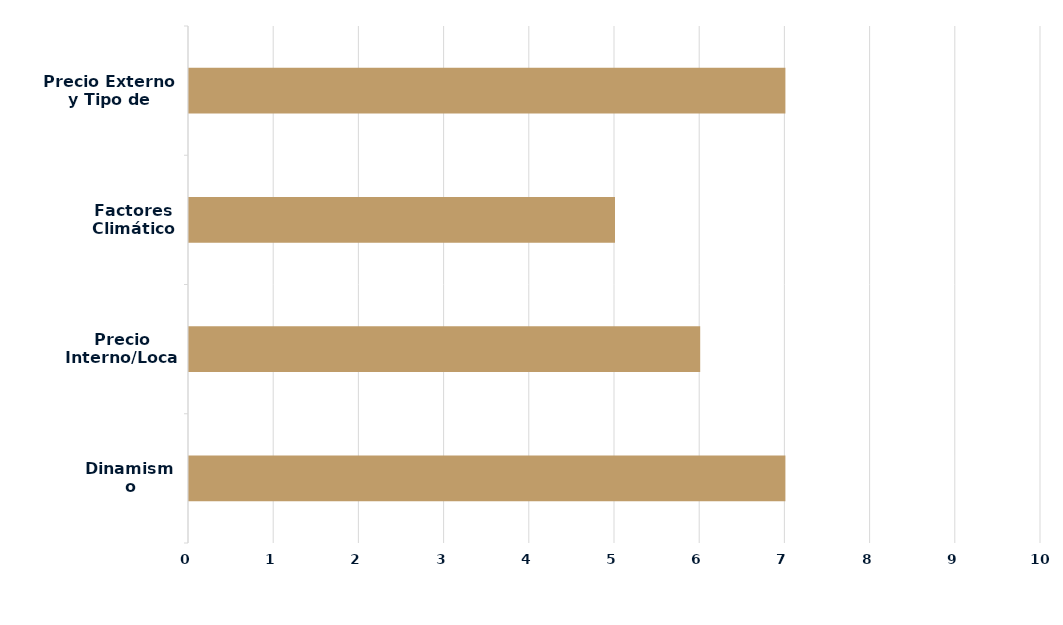
| Category | Series 0 |
|---|---|
| Dinamismo Demanda | 7 |
| Precio Interno/Local | 6 |
| Factores Climáticos | 5 |
| Precio Externo y Tipo de Cambio | 7 |